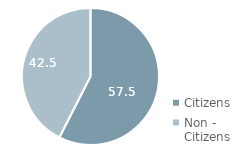
| Category | التعليم الخاص |
|---|---|
| Citizens | 57.513 |
| Non - Citizens | 42.487 |